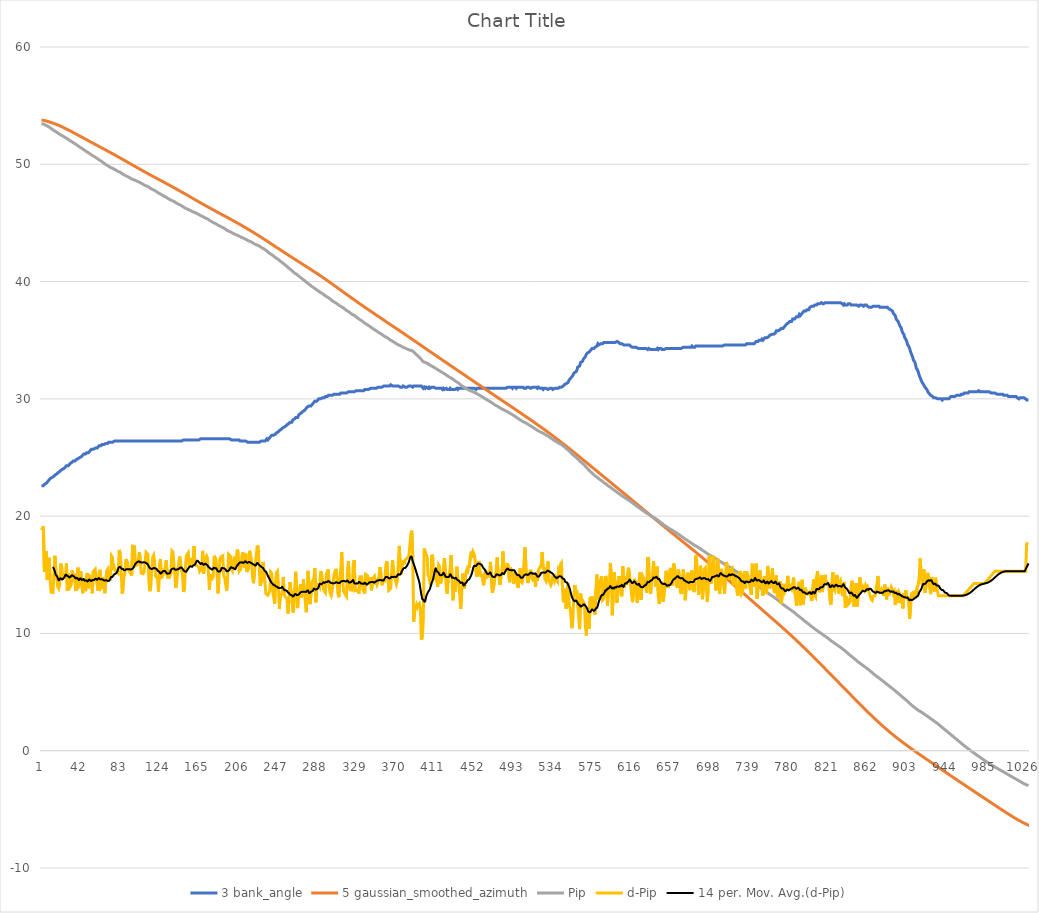
| Category | 3 bank_angle | 5 gaussian_smoothed_azimuth | Pip | d-Pip |
|---|---|---|---|---|
| 0 | 22.6 | 53.787 | 53.457 | 18.808 |
| 1 | 22.6 | 53.77 | 53.445 | 18.809 |
| 2 | 22.6 | 53.751 | 53.436 | 19.128 |
| 3 | 22.7 | 53.732 | 53.389 | 15.278 |
| 4 | 22.7 | 53.711 | 53.35 | 16.126 |
| 5 | 22.8 | 53.69 | 53.321 | 17.016 |
| 6 | 22.9 | 53.667 | 53.266 | 14.56 |
| 7 | 22.9 | 53.644 | 53.212 | 14.589 |
| 8 | 23.1 | 53.619 | 53.176 | 16.446 |
| 9 | 23.2 | 53.593 | 53.123 | 14.668 |
| 10 | 23.2 | 53.566 | 53.058 | 13.519 |
| 11 | 23.3 | 53.538 | 52.993 | 13.483 |
| 12 | 23.3 | 53.509 | 52.928 | 13.493 |
| 13 | 23.4 | 53.48 | 52.862 | 13.429 |
| 14 | 23.5 | 53.449 | 52.829 | 16.62 |
| 15 | 23.5 | 53.417 | 52.782 | 15.364 |
| 16 | 23.6 | 53.384 | 52.735 | 15.322 |
| 17 | 23.7 | 53.35 | 52.675 | 13.962 |
| 18 | 23.7 | 53.315 | 52.613 | 13.821 |
| 19 | 23.8 | 53.28 | 52.555 | 14.175 |
| 20 | 23.9 | 53.243 | 52.515 | 15.959 |
| 21 | 23.9 | 53.206 | 52.472 | 15.742 |
| 22 | 24 | 53.168 | 52.422 | 14.991 |
| 23 | 24 | 53.13 | 52.369 | 14.742 |
| 24 | 24.1 | 53.091 | 52.317 | 14.76 |
| 25 | 24.1 | 53.051 | 52.266 | 14.875 |
| 26 | 24.3 | 53.01 | 52.226 | 15.997 |
| 27 | 24.3 | 52.969 | 52.162 | 13.636 |
| 28 | 24.3 | 52.928 | 52.113 | 15.113 |
| 29 | 24.4 | 52.886 | 52.065 | 15.19 |
| 30 | 24.5 | 52.843 | 52.005 | 13.987 |
| 31 | 24.5 | 52.8 | 51.946 | 14.15 |
| 32 | 24.6 | 52.757 | 51.9 | 15.371 |
| 33 | 24.7 | 52.714 | 51.849 | 14.924 |
| 34 | 24.7 | 52.67 | 51.801 | 15.114 |
| 35 | 24.7 | 52.626 | 51.752 | 15.122 |
| 36 | 24.8 | 52.582 | 51.688 | 13.623 |
| 37 | 24.8 | 52.538 | 51.624 | 13.63 |
| 38 | 24.9 | 52.494 | 51.58 | 15.605 |
| 39 | 24.9 | 52.45 | 51.521 | 14.021 |
| 40 | 25 | 52.405 | 51.462 | 14.143 |
| 41 | 25 | 52.361 | 51.415 | 15.303 |
| 42 | 25.1 | 52.316 | 51.368 | 15.257 |
| 43 | 25.2 | 52.272 | 51.302 | 13.428 |
| 44 | 25.3 | 52.227 | 51.249 | 14.702 |
| 45 | 25.3 | 52.183 | 51.195 | 14.647 |
| 46 | 25.3 | 52.138 | 51.131 | 13.606 |
| 47 | 25.4 | 52.094 | 51.081 | 14.954 |
| 48 | 25.4 | 52.05 | 51.032 | 15.154 |
| 49 | 25.4 | 52.005 | 50.971 | 13.843 |
| 50 | 25.5 | 51.961 | 50.921 | 15.007 |
| 51 | 25.6 | 51.917 | 50.867 | 14.63 |
| 52 | 25.7 | 51.873 | 50.811 | 14.403 |
| 53 | 25.7 | 51.829 | 50.746 | 13.423 |
| 54 | 25.7 | 51.785 | 50.698 | 15.292 |
| 55 | 25.7 | 51.741 | 50.652 | 15.314 |
| 56 | 25.8 | 51.697 | 50.606 | 15.471 |
| 57 | 25.8 | 51.653 | 50.553 | 14.629 |
| 58 | 25.8 | 51.609 | 50.499 | 14.659 |
| 59 | 25.9 | 51.565 | 50.436 | 13.652 |
| 60 | 26 | 51.522 | 50.386 | 15.066 |
| 61 | 26 | 51.478 | 50.341 | 15.426 |
| 62 | 26 | 51.434 | 50.279 | 13.852 |
| 63 | 26.1 | 51.39 | 50.219 | 13.95 |
| 64 | 26.1 | 51.346 | 50.166 | 14.788 |
| 65 | 26.1 | 51.302 | 50.111 | 14.406 |
| 66 | 26.1 | 51.258 | 50.045 | 13.427 |
| 67 | 26.2 | 51.214 | 49.979 | 13.372 |
| 68 | 26.2 | 51.17 | 49.932 | 15.345 |
| 69 | 26.2 | 51.125 | 49.887 | 15.472 |
| 70 | 26.3 | 51.081 | 49.833 | 14.601 |
| 71 | 26.3 | 51.037 | 49.782 | 14.927 |
| 72 | 26.3 | 50.992 | 49.73 | 14.817 |
| 73 | 26.3 | 50.947 | 49.696 | 16.611 |
| 74 | 26.3 | 50.902 | 49.661 | 16.473 |
| 75 | 26.3 | 50.857 | 49.615 | 15.411 |
| 76 | 26.4 | 50.812 | 49.571 | 15.606 |
| 77 | 26.4 | 50.767 | 49.524 | 15.33 |
| 78 | 26.4 | 50.722 | 49.477 | 15.292 |
| 79 | 26.4 | 50.676 | 49.43 | 15.294 |
| 80 | 26.4 | 50.63 | 49.382 | 15.172 |
| 81 | 26.4 | 50.585 | 49.353 | 17.121 |
| 82 | 26.4 | 50.539 | 49.322 | 16.877 |
| 83 | 26.4 | 50.493 | 49.281 | 15.861 |
| 84 | 26.4 | 50.447 | 49.215 | 13.406 |
| 85 | 26.4 | 50.4 | 49.151 | 13.679 |
| 86 | 26.4 | 50.354 | 49.1 | 14.856 |
| 87 | 26.4 | 50.308 | 49.051 | 15.12 |
| 88 | 26.4 | 50.261 | 49.015 | 16.341 |
| 89 | 26.4 | 50.215 | 48.978 | 16.364 |
| 90 | 26.4 | 50.168 | 48.938 | 15.961 |
| 91 | 26.4 | 50.121 | 48.892 | 15.366 |
| 92 | 26.4 | 50.075 | 48.844 | 15.254 |
| 93 | 26.4 | 50.028 | 48.796 | 15.187 |
| 94 | 26.4 | 49.982 | 48.745 | 14.931 |
| 95 | 26.4 | 49.935 | 48.72 | 17.446 |
| 96 | 26.4 | 49.889 | 48.693 | 17.372 |
| 97 | 26.4 | 49.842 | 48.667 | 17.394 |
| 98 | 26.4 | 49.796 | 48.625 | 15.783 |
| 99 | 26.4 | 49.749 | 48.583 | 15.785 |
| 100 | 26.4 | 49.703 | 48.542 | 15.87 |
| 101 | 26.4 | 49.657 | 48.504 | 16.226 |
| 102 | 26.4 | 49.611 | 48.473 | 16.935 |
| 103 | 26.4 | 49.565 | 48.437 | 16.358 |
| 104 | 26.4 | 49.519 | 48.387 | 15.034 |
| 105 | 26.4 | 49.474 | 48.34 | 15.224 |
| 106 | 26.4 | 49.428 | 48.291 | 15.132 |
| 107 | 26.4 | 49.383 | 48.243 | 15.26 |
| 108 | 26.4 | 49.338 | 48.196 | 15.29 |
| 109 | 26.4 | 49.293 | 48.165 | 16.91 |
| 110 | 26.4 | 49.248 | 48.134 | 16.861 |
| 111 | 26.4 | 49.203 | 48.102 | 16.741 |
| 112 | 26.4 | 49.158 | 48.046 | 14.418 |
| 113 | 26.4 | 49.114 | 47.982 | 13.6 |
| 114 | 26.4 | 49.069 | 47.922 | 14.077 |
| 115 | 26.4 | 49.025 | 47.877 | 15.478 |
| 116 | 26.4 | 48.981 | 47.842 | 16.504 |
| 117 | 26.4 | 48.937 | 47.809 | 16.67 |
| 118 | 26.4 | 48.893 | 47.769 | 16.043 |
| 119 | 26.4 | 48.849 | 47.718 | 14.882 |
| 120 | 26.4 | 48.805 | 47.666 | 14.821 |
| 121 | 26.4 | 48.761 | 47.613 | 14.661 |
| 122 | 26.4 | 48.717 | 47.549 | 13.554 |
| 123 | 26.4 | 48.673 | 47.507 | 15.795 |
| 124 | 26.4 | 48.63 | 47.47 | 16.35 |
| 125 | 26.4 | 48.586 | 47.417 | 14.686 |
| 126 | 26.4 | 48.542 | 47.366 | 14.906 |
| 127 | 26.4 | 48.498 | 47.316 | 15.021 |
| 128 | 26.4 | 48.454 | 47.267 | 15.073 |
| 129 | 26.4 | 48.41 | 47.223 | 15.649 |
| 130 | 26.4 | 48.366 | 47.186 | 16.237 |
| 131 | 26.4 | 48.322 | 47.136 | 14.99 |
| 132 | 26.4 | 48.278 | 47.083 | 14.69 |
| 133 | 26.4 | 48.233 | 47.034 | 15.113 |
| 134 | 26.4 | 48.189 | 46.983 | 14.932 |
| 135 | 26.4 | 48.144 | 46.934 | 15.144 |
| 136 | 26.4 | 48.099 | 46.905 | 17.034 |
| 137 | 26.4 | 48.054 | 46.874 | 16.947 |
| 138 | 26.4 | 48.009 | 46.843 | 16.866 |
| 139 | 26.4 | 47.964 | 46.793 | 15.016 |
| 140 | 26.4 | 47.919 | 46.732 | 13.877 |
| 141 | 26.4 | 47.873 | 46.675 | 14.351 |
| 142 | 26.4 | 47.827 | 46.63 | 15.479 |
| 143 | 26.4 | 47.781 | 46.589 | 15.88 |
| 144 | 26.4 | 47.735 | 46.554 | 16.556 |
| 145 | 26.4 | 47.689 | 46.515 | 16.082 |
| 146 | 26.4 | 47.643 | 46.468 | 15.279 |
| 147 | 26.4 | 47.597 | 46.42 | 15.15 |
| 148 | 26.5 | 47.55 | 46.355 | 13.546 |
| 149 | 26.5 | 47.504 | 46.293 | 13.766 |
| 150 | 26.5 | 47.457 | 46.248 | 15.496 |
| 151 | 26.5 | 47.41 | 46.214 | 16.619 |
| 152 | 26.5 | 47.363 | 46.181 | 16.695 |
| 153 | 26.5 | 47.316 | 46.149 | 16.868 |
| 154 | 26.5 | 47.269 | 46.107 | 15.753 |
| 155 | 26.5 | 47.222 | 46.066 | 15.913 |
| 156 | 26.5 | 47.175 | 46.031 | 16.439 |
| 157 | 26.5 | 47.128 | 45.989 | 15.818 |
| 158 | 26.5 | 47.081 | 45.949 | 16.027 |
| 159 | 26.5 | 47.034 | 45.924 | 17.455 |
| 160 | 26.5 | 46.987 | 45.883 | 15.976 |
| 161 | 26.5 | 46.94 | 45.841 | 15.805 |
| 162 | 26.5 | 46.893 | 45.8 | 15.854 |
| 163 | 26.5 | 46.846 | 45.757 | 15.751 |
| 164 | 26.5 | 46.799 | 45.714 | 15.654 |
| 165 | 26.5 | 46.753 | 45.667 | 15.277 |
| 166 | 26.6 | 46.706 | 45.621 | 15.391 |
| 167 | 26.6 | 46.66 | 45.577 | 15.594 |
| 168 | 26.6 | 46.613 | 45.547 | 17.039 |
| 169 | 26.6 | 46.567 | 45.498 | 15.099 |
| 170 | 26.6 | 46.521 | 45.45 | 15.183 |
| 171 | 26.6 | 46.476 | 45.415 | 16.505 |
| 172 | 26.6 | 46.43 | 45.381 | 16.626 |
| 173 | 26.6 | 46.384 | 45.345 | 16.42 |
| 174 | 26.6 | 46.339 | 45.298 | 15.273 |
| 175 | 26.6 | 46.294 | 45.235 | 13.737 |
| 176 | 26.6 | 46.249 | 45.186 | 15.041 |
| 177 | 26.6 | 46.204 | 45.134 | 14.831 |
| 178 | 26.6 | 46.159 | 45.081 | 14.699 |
| 179 | 26.6 | 46.114 | 45.029 | 14.838 |
| 180 | 26.6 | 46.07 | 44.996 | 16.621 |
| 181 | 26.6 | 46.026 | 44.962 | 16.628 |
| 182 | 26.6 | 45.981 | 44.924 | 16.244 |
| 183 | 26.6 | 45.937 | 44.876 | 15.134 |
| 184 | 26.6 | 45.893 | 44.81 | 13.414 |
| 185 | 26.6 | 45.849 | 44.756 | 14.657 |
| 186 | 26.6 | 45.805 | 44.72 | 16.359 |
| 187 | 26.6 | 45.761 | 44.685 | 16.523 |
| 188 | 26.6 | 45.717 | 44.65 | 16.49 |
| 189 | 26.6 | 45.673 | 44.616 | 16.608 |
| 190 | 26.6 | 45.629 | 44.565 | 14.9 |
| 191 | 26.6 | 45.585 | 44.513 | 14.757 |
| 192 | 26.6 | 45.541 | 44.455 | 14.195 |
| 193 | 26.6 | 45.497 | 44.391 | 13.642 |
| 194 | 26.6 | 45.453 | 44.339 | 14.734 |
| 195 | 26.6 | 45.409 | 44.306 | 16.755 |
| 196 | 26.6 | 45.364 | 44.273 | 16.666 |
| 197 | 26.6 | 45.32 | 44.238 | 16.564 |
| 198 | 26.5 | 45.275 | 44.193 | 15.471 |
| 199 | 26.5 | 45.23 | 44.146 | 15.334 |
| 200 | 26.5 | 45.186 | 44.1 | 15.383 |
| 201 | 26.5 | 45.14 | 44.066 | 16.546 |
| 202 | 26.5 | 45.095 | 44.022 | 15.597 |
| 203 | 26.5 | 45.05 | 43.983 | 16.165 |
| 204 | 26.5 | 45.004 | 43.955 | 17.143 |
| 205 | 26.5 | 44.958 | 43.924 | 16.889 |
| 206 | 26.5 | 44.912 | 43.877 | 15.288 |
| 207 | 26.4 | 44.865 | 43.83 | 15.392 |
| 208 | 26.4 | 44.818 | 43.786 | 15.542 |
| 209 | 26.4 | 44.772 | 43.753 | 16.672 |
| 210 | 26.4 | 44.724 | 43.722 | 16.914 |
| 211 | 26.4 | 44.677 | 43.681 | 15.966 |
| 212 | 26.4 | 44.629 | 43.637 | 15.606 |
| 213 | 26.4 | 44.581 | 43.606 | 16.807 |
| 214 | 26.4 | 44.532 | 43.558 | 15.24 |
| 215 | 26.3 | 44.484 | 43.51 | 15.241 |
| 216 | 26.3 | 44.435 | 43.466 | 15.565 |
| 217 | 26.3 | 44.386 | 43.436 | 17.044 |
| 218 | 26.3 | 44.336 | 43.406 | 17 |
| 219 | 26.3 | 44.286 | 43.368 | 16.129 |
| 220 | 26.3 | 44.236 | 43.317 | 14.897 |
| 221 | 26.3 | 44.186 | 43.26 | 14.286 |
| 222 | 26.3 | 44.135 | 43.211 | 15.169 |
| 223 | 26.3 | 44.084 | 43.171 | 16.007 |
| 224 | 26.3 | 44.033 | 43.131 | 15.926 |
| 225 | 26.3 | 43.982 | 43.105 | 17.487 |
| 226 | 26.3 | 43.93 | 43.078 | 17.3 |
| 227 | 26.3 | 43.878 | 43.035 | 15.636 |
| 228 | 26.3 | 43.826 | 42.975 | 14.058 |
| 229 | 26.4 | 43.774 | 42.916 | 14.046 |
| 230 | 26.4 | 43.722 | 42.863 | 14.719 |
| 231 | 26.4 | 43.669 | 42.824 | 16.098 |
| 232 | 26.4 | 43.616 | 42.786 | 16.177 |
| 233 | 26.4 | 43.563 | 42.729 | 14.299 |
| 234 | 26.5 | 43.51 | 42.662 | 13.361 |
| 235 | 26.6 | 43.457 | 42.596 | 13.318 |
| 236 | 26.5 | 43.403 | 42.528 | 13.253 |
| 237 | 26.6 | 43.35 | 42.461 | 13.267 |
| 238 | 26.7 | 43.296 | 42.397 | 13.617 |
| 239 | 26.8 | 43.242 | 42.349 | 15.237 |
| 240 | 26.9 | 43.189 | 42.301 | 15.122 |
| 241 | 26.9 | 43.135 | 42.237 | 13.691 |
| 242 | 26.9 | 43.081 | 42.169 | 13.126 |
| 243 | 26.9 | 43.027 | 42.094 | 12.514 |
| 244 | 27 | 42.973 | 42.038 | 14.384 |
| 245 | 27.1 | 42.919 | 41.99 | 15.183 |
| 246 | 27.1 | 42.865 | 41.943 | 15.3 |
| 247 | 27.2 | 42.811 | 41.884 | 14.099 |
| 248 | 27.3 | 42.758 | 41.804 | 12.075 |
| 249 | 27.3 | 42.704 | 41.739 | 13.45 |
| 250 | 27.4 | 42.65 | 41.672 | 13.283 |
| 251 | 27.5 | 42.596 | 41.606 | 13.432 |
| 252 | 27.5 | 42.543 | 41.554 | 14.805 |
| 253 | 27.6 | 42.489 | 41.489 | 13.458 |
| 254 | 27.6 | 42.436 | 41.42 | 13.129 |
| 255 | 27.7 | 42.383 | 41.352 | 13.207 |
| 256 | 27.8 | 42.329 | 41.282 | 12.994 |
| 257 | 27.8 | 42.276 | 41.199 | 11.696 |
| 258 | 27.9 | 42.223 | 41.127 | 12.867 |
| 259 | 28 | 42.17 | 41.071 | 14.369 |
| 260 | 28 | 42.118 | 41.008 | 13.683 |
| 261 | 28 | 42.065 | 40.943 | 13.472 |
| 262 | 28.2 | 42.012 | 40.861 | 11.783 |
| 263 | 28.2 | 41.96 | 40.781 | 12.017 |
| 264 | 28.3 | 41.907 | 40.719 | 13.838 |
| 265 | 28.4 | 41.855 | 40.672 | 15.263 |
| 266 | 28.4 | 41.803 | 40.624 | 15.247 |
| 267 | 28.4 | 41.751 | 40.546 | 12.158 |
| 268 | 28.6 | 41.699 | 40.479 | 13.343 |
| 269 | 28.7 | 41.647 | 40.415 | 13.576 |
| 270 | 28.7 | 41.595 | 40.357 | 14.196 |
| 271 | 28.8 | 41.543 | 40.287 | 13.048 |
| 272 | 28.9 | 41.491 | 40.221 | 13.391 |
| 273 | 28.9 | 41.439 | 40.167 | 14.618 |
| 274 | 29 | 41.387 | 40.104 | 13.677 |
| 275 | 29.1 | 41.335 | 40.041 | 13.627 |
| 276 | 29.1 | 41.283 | 39.959 | 11.803 |
| 277 | 29.3 | 41.231 | 39.876 | 11.748 |
| 278 | 29.3 | 41.178 | 39.829 | 15.334 |
| 279 | 29.4 | 41.126 | 39.782 | 15.276 |
| 280 | 29.4 | 41.073 | 39.707 | 12.496 |
| 281 | 29.4 | 41.021 | 39.632 | 12.538 |
| 282 | 29.5 | 40.968 | 39.576 | 14.33 |
| 283 | 29.6 | 40.915 | 39.519 | 14.358 |
| 284 | 29.6 | 40.861 | 39.466 | 14.701 |
| 285 | 29.8 | 40.808 | 39.422 | 15.582 |
| 286 | 29.8 | 40.754 | 39.349 | 12.648 |
| 287 | 29.8 | 40.7 | 39.291 | 14.202 |
| 288 | 29.9 | 40.645 | 39.233 | 14.277 |
| 289 | 30 | 40.591 | 39.174 | 14.087 |
| 290 | 30 | 40.536 | 39.114 | 13.946 |
| 291 | 30 | 40.48 | 39.067 | 15.298 |
| 292 | 30 | 40.425 | 39.018 | 15.117 |
| 293 | 30.1 | 40.369 | 38.969 | 15.155 |
| 294 | 30.1 | 40.313 | 38.907 | 13.725 |
| 295 | 30.1 | 40.256 | 38.844 | 13.733 |
| 296 | 30.2 | 40.2 | 38.779 | 13.478 |
| 297 | 30.2 | 40.143 | 38.729 | 15.06 |
| 298 | 30.2 | 40.085 | 38.682 | 15.231 |
| 299 | 30.3 | 40.028 | 38.636 | 15.454 |
| 300 | 30.3 | 39.97 | 38.575 | 13.874 |
| 301 | 30.3 | 39.912 | 38.509 | 13.402 |
| 302 | 30.3 | 39.854 | 38.441 | 13.232 |
| 303 | 30.3 | 39.796 | 38.378 | 13.643 |
| 304 | 30.3 | 39.737 | 38.314 | 13.608 |
| 305 | 30.4 | 39.678 | 38.264 | 15.009 |
| 306 | 30.4 | 39.62 | 38.217 | 15.274 |
| 307 | 30.4 | 39.561 | 38.172 | 15.504 |
| 308 | 30.4 | 39.502 | 38.118 | 14.653 |
| 309 | 30.4 | 39.443 | 38.052 | 13.38 |
| 310 | 30.4 | 39.384 | 37.983 | 13.084 |
| 311 | 30.4 | 39.324 | 37.93 | 14.711 |
| 312 | 30.5 | 39.265 | 37.884 | 15.415 |
| 313 | 30.5 | 39.206 | 37.853 | 16.92 |
| 314 | 30.5 | 39.147 | 37.798 | 14.444 |
| 315 | 30.5 | 39.088 | 37.734 | 13.59 |
| 316 | 30.5 | 39.029 | 37.669 | 13.519 |
| 317 | 30.5 | 38.97 | 37.602 | 13.292 |
| 318 | 30.5 | 38.911 | 37.533 | 13.16 |
| 319 | 30.5 | 38.852 | 37.487 | 15.408 |
| 320 | 30.6 | 38.794 | 37.449 | 16.177 |
| 321 | 30.6 | 38.735 | 37.388 | 13.874 |
| 322 | 30.6 | 38.677 | 37.325 | 13.712 |
| 323 | 30.6 | 38.619 | 37.262 | 13.652 |
| 324 | 30.6 | 38.56 | 37.199 | 13.688 |
| 325 | 30.6 | 38.502 | 37.158 | 15.91 |
| 326 | 30.6 | 38.444 | 37.12 | 16.26 |
| 327 | 30.6 | 38.387 | 37.057 | 13.635 |
| 328 | 30.7 | 38.329 | 36.993 | 13.648 |
| 329 | 30.7 | 38.272 | 36.93 | 13.688 |
| 330 | 30.7 | 38.214 | 36.866 | 13.601 |
| 331 | 30.7 | 38.157 | 36.8 | 13.408 |
| 332 | 30.7 | 38.1 | 36.748 | 14.826 |
| 333 | 30.7 | 38.043 | 36.697 | 14.881 |
| 334 | 30.7 | 37.986 | 36.645 | 14.824 |
| 335 | 30.7 | 37.93 | 36.583 | 13.731 |
| 336 | 30.7 | 37.873 | 36.519 | 13.653 |
| 337 | 30.8 | 37.817 | 36.453 | 13.405 |
| 338 | 30.8 | 37.761 | 36.404 | 15.03 |
| 339 | 30.8 | 37.704 | 36.353 | 14.976 |
| 340 | 30.8 | 37.648 | 36.302 | 14.899 |
| 341 | 30.8 | 37.592 | 36.246 | 14.404 |
| 342 | 30.8 | 37.536 | 36.192 | 14.528 |
| 343 | 30.9 | 37.481 | 36.139 | 14.774 |
| 344 | 30.9 | 37.425 | 36.076 | 13.677 |
| 345 | 30.9 | 37.369 | 36.013 | 13.738 |
| 346 | 30.9 | 37.314 | 35.961 | 14.751 |
| 347 | 30.9 | 37.258 | 35.91 | 14.866 |
| 348 | 30.9 | 37.203 | 35.851 | 14.181 |
| 349 | 30.9 | 37.147 | 35.798 | 14.661 |
| 350 | 30.9 | 37.092 | 35.74 | 14.202 |
| 351 | 31 | 37.037 | 35.684 | 14.426 |
| 352 | 31 | 36.982 | 35.634 | 14.985 |
| 353 | 31 | 36.926 | 35.591 | 15.646 |
| 354 | 31 | 36.871 | 35.54 | 14.953 |
| 355 | 31 | 36.816 | 35.481 | 14.102 |
| 356 | 31 | 36.761 | 35.425 | 14.418 |
| 357 | 31.1 | 36.706 | 35.37 | 14.42 |
| 358 | 31.1 | 36.651 | 35.314 | 14.454 |
| 359 | 31.1 | 36.596 | 35.273 | 15.841 |
| 360 | 31.1 | 36.541 | 35.234 | 16.169 |
| 361 | 31.1 | 36.486 | 35.184 | 14.959 |
| 362 | 31.1 | 36.431 | 35.121 | 13.676 |
| 363 | 31.1 | 36.376 | 35.058 | 13.731 |
| 364 | 31.2 | 36.321 | 34.996 | 13.844 |
| 365 | 31.2 | 36.266 | 34.948 | 15.167 |
| 366 | 31.1 | 36.211 | 34.91 | 16.236 |
| 367 | 31.1 | 36.156 | 34.863 | 15.302 |
| 368 | 31.1 | 36.101 | 34.812 | 14.889 |
| 369 | 31.1 | 36.045 | 34.757 | 14.508 |
| 370 | 31.1 | 35.99 | 34.699 | 14.207 |
| 371 | 31.1 | 35.935 | 34.644 | 14.49 |
| 372 | 31.1 | 35.88 | 34.605 | 16.099 |
| 373 | 31.1 | 35.825 | 34.58 | 17.463 |
| 374 | 31 | 35.769 | 34.537 | 15.684 |
| 375 | 31 | 35.714 | 34.487 | 15.031 |
| 376 | 31 | 35.659 | 34.444 | 15.655 |
| 377 | 31.1 | 35.603 | 34.406 | 16.246 |
| 378 | 31.1 | 35.548 | 34.365 | 15.899 |
| 379 | 31 | 35.492 | 34.327 | 16.229 |
| 380 | 31 | 35.437 | 34.291 | 16.332 |
| 381 | 31 | 35.381 | 34.255 | 16.395 |
| 382 | 31 | 35.325 | 34.22 | 16.487 |
| 383 | 31.1 | 35.27 | 34.185 | 16.585 |
| 384 | 31.1 | 35.214 | 34.152 | 16.614 |
| 385 | 31.1 | 35.158 | 34.135 | 18.361 |
| 386 | 31.1 | 35.102 | 34.123 | 18.765 |
| 387 | 31 | 35.046 | 34.091 | 16.824 |
| 388 | 31.1 | 34.99 | 34.001 | 11.002 |
| 389 | 31.1 | 34.934 | 33.92 | 11.893 |
| 390 | 31.1 | 34.878 | 33.843 | 12.257 |
| 391 | 31.1 | 34.822 | 33.767 | 12.475 |
| 392 | 31.1 | 34.766 | 33.69 | 12.227 |
| 393 | 31.1 | 34.71 | 33.614 | 12.452 |
| 394 | 31.1 | 34.654 | 33.54 | 12.557 |
| 395 | 31.1 | 34.598 | 33.462 | 12.209 |
| 396 | 31.1 | 34.542 | 33.356 | 9.467 |
| 397 | 31 | 34.486 | 33.253 | 9.65 |
| 398 | 30.9 | 34.429 | 33.164 | 11.12 |
| 399 | 31 | 34.373 | 33.137 | 17.241 |
| 400 | 30.9 | 34.317 | 33.106 | 16.933 |
| 401 | 31 | 34.261 | 33.073 | 16.714 |
| 402 | 31 | 34.205 | 33.038 | 16.535 |
| 403 | 30.9 | 34.149 | 32.988 | 14.982 |
| 404 | 31 | 34.092 | 32.936 | 14.777 |
| 405 | 30.9 | 34.036 | 32.879 | 14.298 |
| 406 | 30.9 | 33.98 | 32.82 | 14.105 |
| 407 | 31 | 33.924 | 32.787 | 16.707 |
| 408 | 31 | 33.868 | 32.752 | 16.472 |
| 409 | 31 | 33.812 | 32.697 | 14.572 |
| 410 | 31 | 33.756 | 32.642 | 14.49 |
| 411 | 30.9 | 33.7 | 32.592 | 14.987 |
| 412 | 30.9 | 33.644 | 32.542 | 14.966 |
| 413 | 30.9 | 33.588 | 32.482 | 13.979 |
| 414 | 30.9 | 33.532 | 32.44 | 15.847 |
| 415 | 30.9 | 33.476 | 32.397 | 15.724 |
| 416 | 30.9 | 33.42 | 32.34 | 14.235 |
| 417 | 30.9 | 33.364 | 32.283 | 14.284 |
| 418 | 30.8 | 33.309 | 32.233 | 15.013 |
| 419 | 30.9 | 33.253 | 32.18 | 14.769 |
| 420 | 30.8 | 33.197 | 32.144 | 16.399 |
| 421 | 30.8 | 33.141 | 32.098 | 15.316 |
| 422 | 30.9 | 33.085 | 32.036 | 13.83 |
| 423 | 30.8 | 33.03 | 31.97 | 13.391 |
| 424 | 30.8 | 32.974 | 31.917 | 14.745 |
| 425 | 30.8 | 32.918 | 31.865 | 14.78 |
| 426 | 30.9 | 32.862 | 31.82 | 15.468 |
| 427 | 30.8 | 32.807 | 31.787 | 16.689 |
| 428 | 30.8 | 32.751 | 31.735 | 14.808 |
| 429 | 30.8 | 32.695 | 31.663 | 12.821 |
| 430 | 30.8 | 32.64 | 31.607 | 14.428 |
| 431 | 30.8 | 32.584 | 31.543 | 13.54 |
| 432 | 30.8 | 32.528 | 31.488 | 14.568 |
| 433 | 30.9 | 32.473 | 31.445 | 15.691 |
| 434 | 30.8 | 32.417 | 31.392 | 14.653 |
| 435 | 30.9 | 32.362 | 31.333 | 14.123 |
| 436 | 30.9 | 32.306 | 31.267 | 13.39 |
| 437 | 30.9 | 32.25 | 31.188 | 12.087 |
| 438 | 30.9 | 32.195 | 31.121 | 13.293 |
| 439 | 30.9 | 32.139 | 31.072 | 15.109 |
| 440 | 30.9 | 32.084 | 31.023 | 15.113 |
| 441 | 30.9 | 32.028 | 30.961 | 13.844 |
| 442 | 30.9 | 31.973 | 30.911 | 14.972 |
| 443 | 30.9 | 31.917 | 30.864 | 15.306 |
| 444 | 30.9 | 31.861 | 30.815 | 15.051 |
| 445 | 30.9 | 31.806 | 30.773 | 15.81 |
| 446 | 30.9 | 31.75 | 30.728 | 15.577 |
| 447 | 30.9 | 31.695 | 30.693 | 16.448 |
| 448 | 30.9 | 31.639 | 30.663 | 16.977 |
| 449 | 30.9 | 31.584 | 30.627 | 16.457 |
| 450 | 30.9 | 31.528 | 30.597 | 16.956 |
| 451 | 30.9 | 31.473 | 30.565 | 16.788 |
| 452 | 30.9 | 31.417 | 30.528 | 16.283 |
| 453 | 30.8 | 31.362 | 30.479 | 15.121 |
| 454 | 30.9 | 31.306 | 30.427 | 14.836 |
| 455 | 30.9 | 31.251 | 30.382 | 15.476 |
| 456 | 30.9 | 31.195 | 30.344 | 16.183 |
| 457 | 30.9 | 31.14 | 30.297 | 15.35 |
| 458 | 30.9 | 31.085 | 30.246 | 14.839 |
| 459 | 30.9 | 31.029 | 30.196 | 15.063 |
| 460 | 30.9 | 30.974 | 30.146 | 15.017 |
| 461 | 30.9 | 30.918 | 30.087 | 14.111 |
| 462 | 30.9 | 30.863 | 30.038 | 15.097 |
| 463 | 30.9 | 30.808 | 29.993 | 15.424 |
| 464 | 30.9 | 30.752 | 29.94 | 14.78 |
| 465 | 30.9 | 30.697 | 29.889 | 14.875 |
| 466 | 30.9 | 30.642 | 29.838 | 14.843 |
| 467 | 30.9 | 30.587 | 29.787 | 14.884 |
| 468 | 30.9 | 30.531 | 29.747 | 16.093 |
| 469 | 30.9 | 30.476 | 29.708 | 16.099 |
| 470 | 30.9 | 30.421 | 29.643 | 13.473 |
| 471 | 30.9 | 30.366 | 29.578 | 13.478 |
| 472 | 30.9 | 30.311 | 29.521 | 14.264 |
| 473 | 30.9 | 30.256 | 29.471 | 15.006 |
| 474 | 30.9 | 30.2 | 29.424 | 15.32 |
| 475 | 30.9 | 30.145 | 29.389 | 16.483 |
| 476 | 30.9 | 30.09 | 29.341 | 15.237 |
| 477 | 30.9 | 30.035 | 29.294 | 15.293 |
| 478 | 30.9 | 29.98 | 29.235 | 14.132 |
| 479 | 30.9 | 29.925 | 29.183 | 14.817 |
| 480 | 30.9 | 29.87 | 29.135 | 15.146 |
| 481 | 30.9 | 29.815 | 29.105 | 16.992 |
| 482 | 30.9 | 29.76 | 29.063 | 15.859 |
| 483 | 30.9 | 29.705 | 29.016 | 15.295 |
| 484 | 30.9 | 29.65 | 28.971 | 15.456 |
| 485 | 30.9 | 29.595 | 28.926 | 15.474 |
| 486 | 31 | 29.54 | 28.886 | 16.002 |
| 487 | 31 | 29.485 | 28.845 | 15.921 |
| 488 | 31 | 29.43 | 28.789 | 14.367 |
| 489 | 31 | 29.375 | 28.745 | 15.612 |
| 490 | 31 | 29.32 | 28.697 | 15.277 |
| 491 | 30.9 | 29.265 | 28.648 | 15.102 |
| 492 | 31 | 29.21 | 28.591 | 14.253 |
| 493 | 31 | 29.155 | 28.536 | 14.511 |
| 494 | 31 | 29.1 | 28.488 | 15.193 |
| 495 | 30.9 | 29.044 | 28.436 | 14.751 |
| 496 | 31 | 28.989 | 28.377 | 14.12 |
| 497 | 31 | 28.934 | 28.316 | 13.879 |
| 498 | 31 | 28.878 | 28.264 | 14.893 |
| 499 | 31 | 28.823 | 28.22 | 15.558 |
| 500 | 31 | 28.767 | 28.164 | 14.428 |
| 501 | 31 | 28.712 | 28.108 | 14.339 |
| 502 | 31 | 28.656 | 28.055 | 14.71 |
| 503 | 30.9 | 28.6 | 28.015 | 16.057 |
| 504 | 30.9 | 28.544 | 27.989 | 17.365 |
| 505 | 30.9 | 28.488 | 27.947 | 15.785 |
| 506 | 31 | 28.432 | 27.896 | 14.926 |
| 507 | 31 | 28.375 | 27.839 | 14.291 |
| 508 | 31 | 28.319 | 27.786 | 14.713 |
| 509 | 31 | 28.262 | 27.738 | 15.223 |
| 510 | 30.9 | 28.206 | 27.693 | 15.429 |
| 511 | 30.9 | 28.149 | 27.64 | 14.739 |
| 512 | 31 | 28.092 | 27.586 | 14.589 |
| 513 | 31 | 28.035 | 27.531 | 14.514 |
| 514 | 31 | 27.977 | 27.48 | 14.871 |
| 515 | 31 | 27.92 | 27.419 | 13.962 |
| 516 | 31 | 27.862 | 27.371 | 15.103 |
| 517 | 30.9 | 27.804 | 27.315 | 14.489 |
| 518 | 31 | 27.746 | 27.269 | 15.345 |
| 519 | 31 | 27.688 | 27.224 | 15.547 |
| 520 | 30.9 | 27.63 | 27.181 | 15.627 |
| 521 | 30.9 | 27.571 | 27.139 | 15.887 |
| 522 | 30.9 | 27.513 | 27.109 | 16.943 |
| 523 | 30.8 | 27.453 | 27.064 | 15.475 |
| 524 | 30.9 | 27.394 | 27.02 | 15.653 |
| 525 | 30.9 | 27.335 | 26.966 | 14.62 |
| 526 | 30.9 | 27.275 | 26.911 | 14.477 |
| 527 | 30.9 | 27.215 | 26.863 | 15.162 |
| 528 | 30.8 | 27.155 | 26.824 | 16.14 |
| 529 | 30.8 | 27.095 | 26.769 | 14.494 |
| 530 | 30.9 | 27.034 | 26.712 | 14.326 |
| 531 | 30.9 | 26.973 | 26.654 | 14.116 |
| 532 | 30.9 | 26.912 | 26.597 | 14.317 |
| 533 | 30.8 | 26.851 | 26.546 | 14.912 |
| 534 | 30.8 | 26.79 | 26.494 | 14.771 |
| 535 | 30.9 | 26.728 | 26.438 | 14.487 |
| 536 | 30.9 | 26.666 | 26.386 | 14.779 |
| 537 | 30.9 | 26.604 | 26.335 | 14.858 |
| 538 | 30.9 | 26.541 | 26.279 | 14.446 |
| 539 | 30.9 | 26.478 | 26.233 | 15.427 |
| 540 | 31 | 26.415 | 26.186 | 15.263 |
| 541 | 31 | 26.352 | 26.145 | 15.884 |
| 542 | 31 | 26.289 | 26.105 | 16.012 |
| 543 | 31 | 26.225 | 26.046 | 14.102 |
| 544 | 31.1 | 26.161 | 25.973 | 12.664 |
| 545 | 31.2 | 26.097 | 25.905 | 13.256 |
| 546 | 31.2 | 26.033 | 25.843 | 13.81 |
| 547 | 31.3 | 25.968 | 25.764 | 12.1 |
| 548 | 31.3 | 25.904 | 25.703 | 13.856 |
| 549 | 31.4 | 25.839 | 25.645 | 14.255 |
| 550 | 31.6 | 25.774 | 25.569 | 12.347 |
| 551 | 31.7 | 25.709 | 25.491 | 12.215 |
| 552 | 31.8 | 25.643 | 25.405 | 11.409 |
| 553 | 31.9 | 25.578 | 25.31 | 10.447 |
| 554 | 32 | 25.512 | 25.223 | 11.322 |
| 555 | 32.2 | 25.446 | 25.154 | 13.145 |
| 556 | 32.2 | 25.38 | 25.096 | 14.133 |
| 557 | 32.3 | 25.314 | 25.029 | 13.377 |
| 558 | 32.4 | 25.248 | 24.966 | 13.698 |
| 559 | 32.7 | 25.181 | 24.89 | 12.37 |
| 560 | 32.7 | 25.115 | 24.805 | 11.493 |
| 561 | 32.8 | 25.048 | 24.709 | 10.369 |
| 562 | 33.1 | 24.982 | 24.643 | 13.426 |
| 563 | 33.1 | 24.915 | 24.567 | 12.359 |
| 564 | 33.2 | 24.848 | 24.495 | 12.831 |
| 565 | 33.4 | 24.781 | 24.424 | 12.915 |
| 566 | 33.5 | 24.714 | 24.349 | 12.478 |
| 567 | 33.6 | 24.647 | 24.255 | 10.642 |
| 568 | 33.8 | 24.58 | 24.153 | 9.824 |
| 569 | 33.9 | 24.513 | 24.069 | 11.574 |
| 570 | 33.9 | 24.446 | 23.989 | 11.957 |
| 571 | 34 | 24.379 | 23.893 | 10.423 |
| 572 | 34.1 | 24.312 | 23.824 | 13.062 |
| 573 | 34.1 | 24.245 | 23.743 | 11.917 |
| 574 | 34.3 | 24.177 | 23.674 | 13.155 |
| 575 | 34.3 | 24.11 | 23.595 | 12.056 |
| 576 | 34.3 | 24.043 | 23.52 | 12.509 |
| 577 | 34.4 | 23.976 | 23.436 | 11.615 |
| 578 | 34.4 | 23.908 | 23.374 | 13.745 |
| 579 | 34.5 | 23.841 | 23.324 | 15.027 |
| 580 | 34.7 | 23.774 | 23.253 | 12.891 |
| 581 | 34.6 | 23.706 | 23.187 | 13.447 |
| 582 | 34.6 | 23.639 | 23.131 | 14.352 |
| 583 | 34.7 | 23.572 | 23.074 | 14.294 |
| 584 | 34.7 | 23.504 | 23.022 | 14.865 |
| 585 | 34.7 | 23.437 | 22.951 | 12.848 |
| 586 | 34.8 | 23.37 | 22.88 | 12.943 |
| 587 | 34.8 | 23.303 | 22.814 | 13.346 |
| 588 | 34.8 | 23.235 | 22.763 | 14.894 |
| 589 | 34.8 | 23.168 | 22.71 | 14.729 |
| 590 | 34.8 | 23.101 | 22.634 | 12.366 |
| 591 | 34.8 | 23.034 | 22.571 | 13.698 |
| 592 | 34.8 | 22.966 | 22.509 | 13.852 |
| 593 | 34.8 | 22.899 | 22.469 | 16.008 |
| 594 | 34.8 | 22.832 | 22.419 | 14.946 |
| 595 | 34.8 | 22.764 | 22.334 | 11.545 |
| 596 | 34.8 | 22.697 | 22.267 | 13.315 |
| 597 | 34.8 | 22.63 | 22.22 | 15.243 |
| 598 | 34.8 | 22.562 | 22.159 | 13.973 |
| 599 | 34.8 | 22.495 | 22.104 | 14.438 |
| 600 | 34.9 | 22.428 | 22.03 | 12.589 |
| 601 | 34.9 | 22.36 | 21.973 | 14.31 |
| 602 | 34.8 | 22.293 | 21.922 | 14.884 |
| 603 | 34.7 | 22.225 | 21.868 | 14.596 |
| 604 | 34.7 | 22.158 | 21.801 | 13.338 |
| 605 | 34.7 | 22.091 | 21.733 | 13.165 |
| 606 | 34.7 | 22.023 | 21.69 | 15.728 |
| 607 | 34.6 | 21.956 | 21.634 | 14.369 |
| 608 | 34.6 | 21.888 | 21.576 | 14.193 |
| 609 | 34.6 | 21.821 | 21.524 | 14.894 |
| 610 | 34.6 | 21.753 | 21.466 | 14.124 |
| 611 | 34.6 | 21.685 | 21.417 | 15.149 |
| 612 | 34.6 | 21.618 | 21.373 | 15.604 |
| 613 | 34.6 | 21.55 | 21.323 | 14.945 |
| 614 | 34.5 | 21.483 | 21.272 | 14.893 |
| 615 | 34.5 | 21.415 | 21.206 | 13.47 |
| 616 | 34.4 | 21.347 | 21.133 | 12.665 |
| 617 | 34.4 | 21.28 | 21.066 | 13.291 |
| 618 | 34.4 | 21.212 | 21.013 | 14.661 |
| 619 | 34.4 | 21.144 | 20.955 | 14.246 |
| 620 | 34.4 | 21.077 | 20.9 | 14.488 |
| 621 | 34.4 | 21.009 | 20.826 | 12.63 |
| 622 | 34.3 | 20.941 | 20.76 | 13.397 |
| 623 | 34.3 | 20.874 | 20.705 | 14.481 |
| 624 | 34.3 | 20.806 | 20.657 | 15.202 |
| 625 | 34.3 | 20.738 | 20.586 | 12.872 |
| 626 | 34.3 | 20.671 | 20.528 | 14.2 |
| 627 | 34.3 | 20.603 | 20.476 | 14.843 |
| 628 | 34.3 | 20.535 | 20.423 | 14.658 |
| 629 | 34.3 | 20.468 | 20.37 | 14.686 |
| 630 | 34.3 | 20.4 | 20.308 | 13.827 |
| 631 | 34.3 | 20.332 | 20.242 | 13.468 |
| 632 | 34.2 | 20.265 | 20.207 | 16.484 |
| 633 | 34.3 | 20.197 | 20.171 | 16.319 |
| 634 | 34.3 | 20.129 | 20.11 | 13.947 |
| 635 | 34.2 | 20.062 | 20.044 | 13.38 |
| 636 | 34.2 | 19.994 | 19.989 | 14.556 |
| 637 | 34.2 | 19.927 | 19.939 | 14.976 |
| 638 | 34.2 | 19.859 | 19.901 | 16.175 |
| 639 | 34.2 | 19.792 | 19.852 | 15.119 |
| 640 | 34.2 | 19.724 | 19.792 | 13.996 |
| 641 | 34.2 | 19.657 | 19.742 | 15.009 |
| 642 | 34.3 | 19.59 | 19.699 | 15.705 |
| 643 | 34.2 | 19.522 | 19.631 | 13.192 |
| 644 | 34.3 | 19.455 | 19.556 | 12.509 |
| 645 | 34.3 | 19.388 | 19.493 | 13.676 |
| 646 | 34.3 | 19.321 | 19.434 | 14.077 |
| 647 | 34.2 | 19.253 | 19.378 | 14.4 |
| 648 | 34.2 | 19.186 | 19.305 | 12.72 |
| 649 | 34.2 | 19.119 | 19.237 | 13.244 |
| 650 | 34.2 | 19.052 | 19.178 | 14.109 |
| 651 | 34.3 | 18.986 | 19.132 | 15.345 |
| 652 | 34.3 | 18.919 | 19.082 | 15.052 |
| 653 | 34.3 | 18.852 | 19.021 | 13.873 |
| 654 | 34.3 | 18.785 | 18.965 | 14.367 |
| 655 | 34.3 | 18.719 | 18.918 | 15.369 |
| 656 | 34.3 | 18.652 | 18.874 | 15.588 |
| 657 | 34.3 | 18.586 | 18.821 | 14.676 |
| 658 | 34.3 | 18.52 | 18.762 | 14.089 |
| 659 | 34.3 | 18.453 | 18.722 | 15.961 |
| 660 | 34.3 | 18.387 | 18.678 | 15.637 |
| 661 | 34.3 | 18.321 | 18.628 | 15.04 |
| 662 | 34.3 | 18.255 | 18.569 | 14.066 |
| 663 | 34.3 | 18.189 | 18.508 | 13.883 |
| 664 | 34.3 | 18.123 | 18.462 | 15.439 |
| 665 | 34.3 | 18.057 | 18.411 | 14.855 |
| 666 | 34.3 | 17.991 | 18.347 | 13.582 |
| 667 | 34.3 | 17.925 | 18.28 | 13.358 |
| 668 | 34.3 | 17.859 | 18.224 | 14.377 |
| 669 | 34.4 | 17.793 | 18.179 | 15.462 |
| 670 | 34.4 | 17.727 | 18.126 | 14.788 |
| 671 | 34.4 | 17.661 | 18.055 | 12.826 |
| 672 | 34.4 | 17.595 | 17.993 | 13.804 |
| 673 | 34.4 | 17.529 | 17.942 | 14.876 |
| 674 | 34.4 | 17.463 | 17.893 | 15.191 |
| 675 | 34.4 | 17.397 | 17.837 | 14.315 |
| 676 | 34.4 | 17.331 | 17.773 | 13.683 |
| 677 | 34.4 | 17.264 | 17.722 | 14.857 |
| 678 | 34.5 | 17.198 | 17.676 | 15.371 |
| 679 | 34.4 | 17.131 | 17.625 | 14.92 |
| 680 | 34.4 | 17.065 | 17.56 | 13.521 |
| 681 | 34.4 | 16.998 | 17.498 | 13.756 |
| 682 | 34.5 | 16.931 | 17.464 | 16.661 |
| 683 | 34.5 | 16.864 | 17.426 | 16.209 |
| 684 | 34.5 | 16.796 | 17.378 | 15.165 |
| 685 | 34.5 | 16.729 | 17.311 | 13.283 |
| 686 | 34.5 | 16.661 | 17.251 | 14.002 |
| 687 | 34.5 | 16.593 | 17.209 | 15.773 |
| 688 | 34.5 | 16.525 | 17.158 | 14.955 |
| 689 | 34.5 | 16.456 | 17.087 | 12.918 |
| 690 | 34.5 | 16.388 | 17.027 | 13.921 |
| 691 | 34.5 | 16.319 | 16.981 | 15.491 |
| 692 | 34.5 | 16.25 | 16.937 | 15.6 |
| 693 | 34.5 | 16.181 | 16.881 | 14.348 |
| 694 | 34.5 | 16.111 | 16.808 | 12.689 |
| 695 | 34.5 | 16.042 | 16.745 | 13.728 |
| 696 | 34.5 | 15.972 | 16.712 | 16.66 |
| 697 | 34.5 | 15.902 | 16.662 | 15.043 |
| 698 | 34.5 | 15.832 | 16.604 | 14.226 |
| 699 | 34.5 | 15.761 | 16.554 | 14.934 |
| 700 | 34.5 | 15.691 | 16.52 | 16.607 |
| 701 | 34.5 | 15.62 | 16.484 | 16.436 |
| 702 | 34.5 | 15.549 | 16.434 | 14.95 |
| 703 | 34.5 | 15.478 | 16.37 | 13.66 |
| 704 | 34.5 | 15.407 | 16.311 | 14.122 |
| 705 | 34.5 | 15.336 | 16.275 | 16.361 |
| 706 | 34.5 | 15.265 | 16.227 | 15.192 |
| 707 | 34.5 | 15.193 | 16.161 | 13.386 |
| 708 | 34.5 | 15.122 | 16.11 | 14.938 |
| 709 | 34.5 | 15.05 | 16.065 | 15.507 |
| 710 | 34.5 | 14.979 | 16.02 | 15.487 |
| 711 | 34.5 | 14.907 | 15.962 | 14.215 |
| 712 | 34.6 | 14.836 | 15.896 | 13.391 |
| 713 | 34.6 | 14.764 | 15.842 | 14.604 |
| 714 | 34.6 | 14.692 | 15.803 | 16.089 |
| 715 | 34.6 | 14.621 | 15.763 | 16.017 |
| 716 | 34.6 | 14.549 | 15.716 | 15.262 |
| 717 | 34.6 | 14.477 | 15.662 | 14.595 |
| 718 | 34.6 | 14.406 | 15.616 | 15.441 |
| 719 | 34.6 | 14.334 | 15.57 | 15.391 |
| 720 | 34.6 | 14.262 | 15.526 | 15.577 |
| 721 | 34.6 | 14.191 | 15.467 | 14.081 |
| 722 | 34.6 | 14.119 | 15.411 | 14.428 |
| 723 | 34.6 | 14.047 | 15.363 | 15.212 |
| 724 | 34.6 | 13.976 | 15.31 | 14.64 |
| 725 | 34.6 | 13.904 | 15.245 | 13.554 |
| 726 | 34.6 | 13.832 | 15.177 | 13.229 |
| 727 | 34.6 | 13.761 | 15.113 | 13.586 |
| 728 | 34.6 | 13.689 | 15.067 | 15.327 |
| 729 | 34.6 | 13.617 | 15.016 | 14.974 |
| 730 | 34.6 | 13.545 | 14.95 | 13.368 |
| 731 | 34.6 | 13.474 | 14.885 | 13.499 |
| 732 | 34.6 | 13.402 | 14.835 | 15.051 |
| 733 | 34.6 | 13.33 | 14.789 | 15.303 |
| 734 | 34.6 | 13.258 | 14.727 | 13.83 |
| 735 | 34.7 | 13.186 | 14.68 | 15.283 |
| 736 | 34.7 | 13.114 | 14.632 | 15.205 |
| 737 | 34.7 | 13.042 | 14.579 | 14.747 |
| 738 | 34.7 | 12.97 | 14.52 | 14.128 |
| 739 | 34.7 | 12.898 | 14.461 | 14.082 |
| 740 | 34.7 | 12.826 | 14.394 | 13.291 |
| 741 | 34.7 | 12.754 | 14.354 | 15.944 |
| 742 | 34.7 | 12.682 | 14.3 | 14.668 |
| 743 | 34.7 | 12.61 | 14.24 | 13.983 |
| 744 | 34.8 | 12.538 | 14.189 | 14.879 |
| 745 | 34.9 | 12.466 | 14.148 | 15.954 |
| 746 | 34.9 | 12.395 | 14.078 | 12.945 |
| 747 | 34.9 | 12.323 | 14.018 | 13.997 |
| 748 | 35 | 12.251 | 13.964 | 14.586 |
| 749 | 35 | 12.179 | 13.918 | 15.381 |
| 750 | 35 | 12.107 | 13.86 | 14.246 |
| 751 | 35.1 | 12.035 | 13.8 | 13.959 |
| 752 | 35 | 11.963 | 13.732 | 13.225 |
| 753 | 35.1 | 11.892 | 13.679 | 14.686 |
| 754 | 35.2 | 11.82 | 13.627 | 14.86 |
| 755 | 35.2 | 11.748 | 13.561 | 13.365 |
| 756 | 35.2 | 11.677 | 13.498 | 13.672 |
| 757 | 35.2 | 11.605 | 13.455 | 15.757 |
| 758 | 35.3 | 11.534 | 13.406 | 15.067 |
| 759 | 35.4 | 11.462 | 13.344 | 13.833 |
| 760 | 35.4 | 11.391 | 13.285 | 14.116 |
| 761 | 35.5 | 11.319 | 13.233 | 14.76 |
| 762 | 35.5 | 11.248 | 13.188 | 15.546 |
| 763 | 35.5 | 11.176 | 13.128 | 13.919 |
| 764 | 35.5 | 11.104 | 13.062 | 13.439 |
| 765 | 35.6 | 11.033 | 13.002 | 14 |
| 766 | 35.8 | 10.961 | 12.952 | 14.946 |
| 767 | 35.8 | 10.889 | 12.884 | 13.281 |
| 768 | 35.8 | 10.817 | 12.815 | 13.028 |
| 769 | 35.8 | 10.745 | 12.75 | 13.558 |
| 770 | 35.9 | 10.673 | 12.695 | 14.469 |
| 771 | 36 | 10.6 | 12.62 | 12.517 |
| 772 | 36 | 10.527 | 12.55 | 13.02 |
| 773 | 36 | 10.455 | 12.48 | 12.995 |
| 774 | 36.1 | 10.382 | 12.423 | 14.232 |
| 775 | 36.2 | 10.308 | 12.358 | 13.555 |
| 776 | 36.3 | 10.235 | 12.295 | 13.723 |
| 777 | 36.4 | 10.161 | 12.235 | 13.961 |
| 778 | 36.4 | 10.087 | 12.184 | 14.91 |
| 779 | 36.5 | 10.013 | 12.124 | 13.957 |
| 780 | 36.6 | 9.938 | 12.065 | 14.101 |
| 781 | 36.6 | 9.863 | 12.006 | 14.179 |
| 782 | 36.6 | 9.788 | 11.944 | 13.791 |
| 783 | 36.8 | 9.712 | 11.886 | 14.202 |
| 784 | 36.8 | 9.636 | 11.834 | 14.765 |
| 785 | 36.8 | 9.56 | 11.77 | 13.595 |
| 786 | 36.9 | 9.483 | 11.701 | 13.137 |
| 787 | 37 | 9.407 | 11.625 | 12.365 |
| 788 | 37 | 9.329 | 11.556 | 13.1 |
| 789 | 37 | 9.252 | 11.497 | 14.106 |
| 790 | 37.2 | 9.174 | 11.441 | 14.402 |
| 791 | 37.1 | 9.096 | 11.365 | 12.404 |
| 792 | 37.1 | 9.017 | 11.3 | 13.536 |
| 793 | 37.3 | 8.938 | 11.246 | 14.579 |
| 794 | 37.4 | 8.859 | 11.171 | 12.469 |
| 795 | 37.5 | 8.78 | 11.096 | 12.526 |
| 796 | 37.5 | 8.7 | 11.035 | 13.906 |
| 797 | 37.5 | 8.62 | 10.972 | 13.704 |
| 798 | 37.6 | 8.54 | 10.909 | 13.689 |
| 799 | 37.6 | 8.46 | 10.843 | 13.364 |
| 800 | 37.6 | 8.379 | 10.776 | 13.36 |
| 801 | 37.8 | 8.298 | 10.711 | 13.506 |
| 802 | 37.8 | 8.217 | 10.647 | 13.547 |
| 803 | 37.9 | 8.136 | 10.575 | 12.761 |
| 804 | 37.9 | 8.054 | 10.513 | 13.885 |
| 805 | 37.9 | 7.972 | 10.459 | 14.598 |
| 806 | 38 | 7.891 | 10.392 | 13.264 |
| 807 | 38 | 7.809 | 10.323 | 13.121 |
| 808 | 38 | 7.726 | 10.271 | 14.808 |
| 809 | 38.1 | 7.644 | 10.224 | 15.297 |
| 810 | 38.1 | 7.562 | 10.164 | 14.013 |
| 811 | 38.1 | 7.479 | 10.099 | 13.508 |
| 812 | 38.1 | 7.397 | 10.042 | 14.211 |
| 813 | 38.2 | 7.314 | 9.991 | 14.971 |
| 814 | 38.2 | 7.231 | 9.927 | 13.526 |
| 815 | 38.1 | 7.149 | 9.862 | 13.586 |
| 816 | 38.1 | 7.066 | 9.809 | 14.698 |
| 817 | 38.2 | 6.983 | 9.759 | 14.997 |
| 818 | 38.2 | 6.9 | 9.701 | 14.136 |
| 819 | 38.2 | 6.817 | 9.644 | 14.322 |
| 820 | 38.2 | 6.734 | 9.586 | 14.198 |
| 821 | 38.2 | 6.65 | 9.525 | 13.914 |
| 822 | 38.2 | 6.567 | 9.453 | 12.838 |
| 823 | 38.2 | 6.484 | 9.378 | 12.458 |
| 824 | 38.2 | 6.401 | 9.321 | 14.344 |
| 825 | 38.2 | 6.317 | 9.274 | 15.218 |
| 826 | 38.2 | 6.234 | 9.211 | 13.772 |
| 827 | 38.2 | 6.151 | 9.148 | 13.635 |
| 828 | 38.2 | 6.067 | 9.092 | 14.41 |
| 829 | 38.2 | 5.984 | 9.042 | 14.986 |
| 830 | 38.2 | 5.901 | 8.988 | 14.676 |
| 831 | 38.2 | 5.817 | 8.922 | 13.402 |
| 832 | 38.2 | 5.734 | 8.865 | 14.276 |
| 833 | 38.2 | 5.65 | 8.81 | 14.468 |
| 834 | 38.2 | 5.567 | 8.75 | 14.004 |
| 835 | 38.1 | 5.483 | 8.682 | 13.177 |
| 836 | 38 | 5.4 | 8.623 | 14.131 |
| 837 | 38.1 | 5.316 | 8.567 | 14.395 |
| 838 | 38 | 5.233 | 8.489 | 12.21 |
| 839 | 38 | 5.149 | 8.42 | 13.136 |
| 840 | 38 | 5.066 | 8.35 | 12.933 |
| 841 | 38.1 | 4.982 | 8.274 | 12.472 |
| 842 | 38.1 | 4.899 | 8.2 | 12.564 |
| 843 | 38.1 | 4.816 | 8.127 | 12.682 |
| 844 | 38 | 4.732 | 8.067 | 13.981 |
| 845 | 38 | 4.649 | 8.012 | 14.494 |
| 846 | 38 | 4.566 | 7.946 | 13.389 |
| 847 | 38 | 4.483 | 7.868 | 12.292 |
| 848 | 38 | 4.4 | 7.799 | 13.008 |
| 849 | 38 | 4.317 | 7.741 | 14.292 |
| 850 | 38 | 4.234 | 7.664 | 12.274 |
| 851 | 38 | 4.151 | 7.592 | 12.77 |
| 852 | 37.9 | 4.068 | 7.526 | 13.447 |
| 853 | 38 | 3.986 | 7.474 | 14.778 |
| 854 | 38 | 3.904 | 7.416 | 14.189 |
| 855 | 38 | 3.822 | 7.355 | 13.851 |
| 856 | 38 | 3.74 | 7.295 | 14.015 |
| 857 | 37.9 | 3.658 | 7.235 | 14.054 |
| 858 | 38 | 3.577 | 7.172 | 13.713 |
| 859 | 38 | 3.496 | 7.113 | 14.067 |
| 860 | 38 | 3.415 | 7.051 | 13.832 |
| 861 | 37.9 | 3.335 | 6.991 | 13.974 |
| 862 | 37.9 | 3.255 | 6.928 | 13.641 |
| 863 | 37.8 | 3.175 | 6.862 | 13.449 |
| 864 | 37.8 | 3.095 | 6.796 | 13.397 |
| 865 | 37.8 | 3.016 | 6.725 | 12.908 |
| 866 | 37.8 | 2.938 | 6.653 | 12.819 |
| 867 | 37.9 | 2.86 | 6.585 | 13.161 |
| 868 | 37.9 | 2.782 | 6.516 | 13.155 |
| 869 | 37.9 | 2.704 | 6.449 | 13.216 |
| 870 | 37.9 | 2.628 | 6.38 | 13.14 |
| 871 | 37.9 | 2.551 | 6.323 | 14.269 |
| 872 | 37.9 | 2.475 | 6.272 | 14.903 |
| 873 | 37.9 | 2.4 | 6.206 | 13.419 |
| 874 | 37.8 | 2.325 | 6.142 | 13.648 |
| 875 | 37.8 | 2.251 | 6.076 | 13.358 |
| 876 | 37.8 | 2.177 | 6.013 | 13.69 |
| 877 | 37.8 | 2.104 | 5.948 | 13.499 |
| 878 | 37.8 | 2.032 | 5.88 | 13.213 |
| 879 | 37.8 | 1.96 | 5.822 | 14.173 |
| 880 | 37.8 | 1.888 | 5.76 | 13.799 |
| 881 | 37.8 | 1.818 | 5.689 | 12.897 |
| 882 | 37.8 | 1.747 | 5.628 | 13.905 |
| 883 | 37.7 | 1.678 | 5.56 | 13.209 |
| 884 | 37.7 | 1.609 | 5.494 | 13.449 |
| 885 | 37.6 | 1.54 | 5.43 | 13.556 |
| 886 | 37.6 | 1.473 | 5.369 | 13.93 |
| 887 | 37.5 | 1.405 | 5.306 | 13.734 |
| 888 | 37.3 | 1.339 | 5.24 | 13.385 |
| 889 | 37.2 | 1.273 | 5.176 | 13.544 |
| 890 | 37.1 | 1.207 | 5.1 | 12.428 |
| 891 | 36.8 | 1.142 | 5.03 | 13.003 |
| 892 | 36.7 | 1.078 | 4.967 | 13.662 |
| 893 | 36.6 | 1.014 | 4.893 | 12.603 |
| 894 | 36.4 | 0.95 | 4.828 | 13.513 |
| 895 | 36.2 | 0.887 | 4.761 | 13.358 |
| 896 | 36.1 | 0.825 | 4.687 | 12.566 |
| 897 | 35.8 | 0.763 | 4.616 | 12.924 |
| 898 | 35.6 | 0.701 | 4.538 | 12.132 |
| 899 | 35.5 | 0.64 | 4.472 | 13.453 |
| 900 | 35.2 | 0.579 | 4.403 | 13.05 |
| 901 | 35.1 | 0.519 | 4.34 | 13.696 |
| 902 | 34.9 | 0.459 | 4.269 | 12.938 |
| 903 | 34.6 | 0.399 | 4.201 | 13.181 |
| 904 | 34.5 | 0.34 | 4.127 | 12.616 |
| 905 | 34.3 | 0.281 | 4.039 | 11.25 |
| 906 | 34 | 0.222 | 3.961 | 12.19 |
| 907 | 33.8 | 0.164 | 3.896 | 13.477 |
| 908 | 33.6 | 0.106 | 3.826 | 13.026 |
| 909 | 33.3 | 0.048 | 3.762 | 13.587 |
| 910 | 33.2 | -0.01 | 3.696 | 13.354 |
| 911 | 33 | -0.068 | 3.632 | 13.663 |
| 912 | 32.6 | -0.125 | 3.565 | 13.219 |
| 913 | 32.5 | -0.182 | 3.505 | 13.994 |
| 914 | 32.3 | -0.239 | 3.446 | 14.137 |
| 915 | 32 | -0.296 | 3.394 | 14.779 |
| 916 | 31.8 | -0.353 | 3.358 | 16.387 |
| 917 | 31.8 | -0.409 | 3.309 | 15.178 |
| 918 | 31.4 | -0.466 | 3.251 | 14.173 |
| 919 | 31.3 | -0.522 | 3.195 | 14.382 |
| 920 | 31.3 | -0.578 | 3.149 | 15.455 |
| 921 | 31 | -0.635 | 3.084 | 13.461 |
| 922 | 31 | -0.691 | 3.018 | 13.386 |
| 923 | 30.8 | -0.747 | 2.963 | 14.553 |
| 924 | 30.6 | -0.803 | 2.915 | 15.167 |
| 925 | 30.5 | -0.859 | 2.861 | 14.543 |
| 926 | 30.5 | -0.915 | 2.799 | 13.863 |
| 927 | 30.3 | -0.97 | 2.733 | 13.351 |
| 928 | 30.3 | -1.026 | 2.681 | 14.815 |
| 929 | 30.2 | -1.082 | 2.625 | 14.364 |
| 930 | 30.1 | -1.138 | 2.562 | 13.737 |
| 931 | 30.1 | -1.193 | 2.498 | 13.569 |
| 932 | 30.1 | -1.249 | 2.445 | 14.75 |
| 933 | 30.1 | -1.305 | 2.387 | 14.194 |
| 934 | 30 | -1.36 | 2.323 | 13.618 |
| 935 | 30 | -1.416 | 2.255 | 13.222 |
| 936 | 30 | -1.471 | 2.188 | 13.222 |
| 937 | 30 | -1.527 | 2.12 | 13.222 |
| 938 | 30 | -1.582 | 2.052 | 13.222 |
| 939 | 29.9 | -1.638 | 1.984 | 13.222 |
| 940 | 30 | -1.693 | 1.916 | 13.222 |
| 941 | 30 | -1.749 | 1.849 | 13.222 |
| 942 | 30 | -1.804 | 1.781 | 13.222 |
| 943 | 30 | -1.86 | 1.713 | 13.222 |
| 944 | 30 | -1.915 | 1.645 | 13.222 |
| 945 | 30 | -1.971 | 1.578 | 13.222 |
| 946 | 30 | -2.026 | 1.51 | 13.222 |
| 947 | 30.1 | -2.081 | 1.442 | 13.222 |
| 948 | 30.2 | -2.137 | 1.374 | 13.222 |
| 949 | 30.2 | -2.192 | 1.306 | 13.222 |
| 950 | 30.2 | -2.247 | 1.239 | 13.222 |
| 951 | 30.2 | -2.303 | 1.171 | 13.222 |
| 952 | 30.2 | -2.358 | 1.103 | 13.222 |
| 953 | 30.2 | -2.413 | 1.035 | 13.222 |
| 954 | 30.3 | -2.468 | 0.968 | 13.222 |
| 955 | 30.3 | -2.523 | 0.9 | 13.222 |
| 956 | 30.3 | -2.578 | 0.832 | 13.222 |
| 957 | 30.3 | -2.634 | 0.764 | 13.222 |
| 958 | 30.3 | -2.689 | 0.696 | 13.222 |
| 959 | 30.4 | -2.744 | 0.629 | 13.222 |
| 960 | 30.4 | -2.799 | 0.561 | 13.222 |
| 961 | 30.4 | -2.854 | 0.493 | 13.222 |
| 962 | 30.5 | -2.908 | 0.426 | 13.315 |
| 963 | 30.5 | -2.963 | 0.36 | 13.409 |
| 964 | 30.5 | -3.018 | 0.295 | 13.502 |
| 965 | 30.5 | -3.073 | 0.231 | 13.596 |
| 966 | 30.5 | -3.128 | 0.168 | 13.69 |
| 967 | 30.6 | -3.183 | 0.106 | 13.783 |
| 968 | 30.6 | -3.237 | 0.045 | 13.877 |
| 969 | 30.6 | -3.292 | -0.016 | 13.97 |
| 970 | 30.6 | -3.347 | -0.075 | 14.064 |
| 971 | 30.6 | -3.401 | -0.133 | 14.157 |
| 972 | 30.6 | -3.456 | -0.191 | 14.251 |
| 973 | 30.6 | -3.51 | -0.248 | 14.251 |
| 974 | 30.6 | -3.565 | -0.306 | 14.251 |
| 975 | 30.6 | -3.619 | -0.363 | 14.251 |
| 976 | 30.6 | -3.674 | -0.421 | 14.251 |
| 977 | 30.7 | -3.729 | -0.478 | 14.251 |
| 978 | 30.6 | -3.783 | -0.536 | 14.251 |
| 979 | 30.6 | -3.837 | -0.593 | 14.251 |
| 980 | 30.6 | -3.892 | -0.651 | 14.251 |
| 981 | 30.6 | -3.946 | -0.708 | 14.251 |
| 982 | 30.6 | -4.001 | -0.766 | 14.251 |
| 983 | 30.6 | -4.055 | -0.823 | 14.251 |
| 984 | 30.6 | -4.11 | -0.88 | 14.347 |
| 985 | 30.6 | -4.164 | -0.935 | 14.443 |
| 986 | 30.6 | -4.219 | -0.99 | 14.538 |
| 987 | 30.6 | -4.273 | -1.044 | 14.634 |
| 988 | 30.6 | -4.327 | -1.096 | 14.73 |
| 989 | 30.6 | -4.382 | -1.148 | 14.826 |
| 990 | 30.5 | -4.436 | -1.199 | 14.921 |
| 991 | 30.5 | -4.491 | -1.249 | 15.017 |
| 992 | 30.5 | -4.545 | -1.297 | 15.113 |
| 993 | 30.5 | -4.599 | -1.345 | 15.209 |
| 994 | 30.5 | -4.654 | -1.392 | 15.305 |
| 995 | 30.5 | -4.708 | -1.439 | 15.305 |
| 996 | 30.4 | -4.762 | -1.486 | 15.305 |
| 997 | 30.4 | -4.816 | -1.533 | 15.305 |
| 998 | 30.4 | -4.87 | -1.58 | 15.305 |
| 999 | 30.4 | -4.924 | -1.627 | 15.305 |
| 1000 | 30.4 | -4.978 | -1.674 | 15.305 |
| 1001 | 30.4 | -5.032 | -1.721 | 15.305 |
| 1002 | 30.4 | -5.085 | -1.768 | 15.305 |
| 1003 | 30.3 | -5.138 | -1.815 | 15.305 |
| 1004 | 30.3 | -5.191 | -1.862 | 15.305 |
| 1005 | 30.3 | -5.244 | -1.909 | 15.305 |
| 1006 | 30.3 | -5.297 | -1.956 | 15.305 |
| 1007 | 30.3 | -5.349 | -2.003 | 15.305 |
| 1008 | 30.2 | -5.401 | -2.05 | 15.305 |
| 1009 | 30.2 | -5.453 | -2.097 | 15.305 |
| 1010 | 30.2 | -5.504 | -2.144 | 15.305 |
| 1011 | 30.2 | -5.555 | -2.191 | 15.305 |
| 1012 | 30.2 | -5.605 | -2.238 | 15.305 |
| 1013 | 30.2 | -5.655 | -2.284 | 15.305 |
| 1014 | 30.2 | -5.704 | -2.331 | 15.305 |
| 1015 | 30.2 | -5.753 | -2.378 | 15.305 |
| 1016 | 30.2 | -5.801 | -2.425 | 15.305 |
| 1017 | 30.1 | -5.849 | -2.472 | 15.305 |
| 1018 | 30.1 | -5.895 | -2.519 | 15.305 |
| 1019 | 30 | -5.941 | -2.566 | 15.305 |
| 1020 | 30.1 | -5.987 | -2.613 | 15.305 |
| 1021 | 30.1 | -6.031 | -2.66 | 15.305 |
| 1022 | 30.1 | -6.074 | -2.707 | 15.305 |
| 1023 | 30.1 | -6.117 | -2.754 | 15.305 |
| 1024 | 30.1 | -6.159 | -2.801 | 15.305 |
| 1025 | 30.1 | -6.2 | -2.848 | 15.305 |
| 1026 | 30 | -6.239 | -2.895 | 15.305 |
| 1027 | 29.9 | -6.278 | -2.918 | 17.652 |
| 1028 | 29.9 | -6.316 | -2.942 | 17.652 |
| 1029 | 29.9 | -6.35 | -2.965 | 17.652 |
| 1030 | 29.9 | -6.4 | -2.989 | 17.652 |